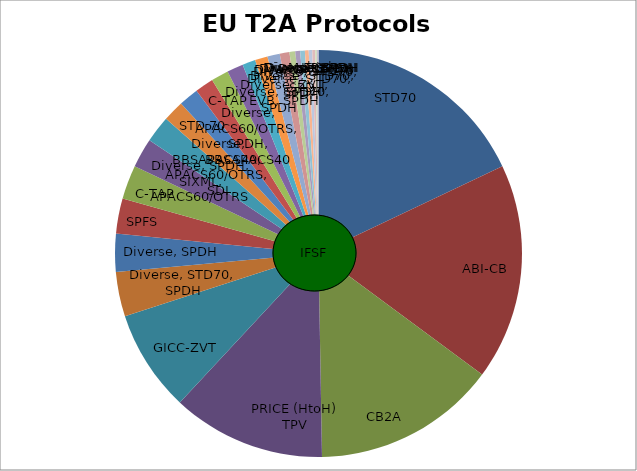
| Category | EU Terminals |
|---|---|
| STD70 | 1653.91 |
| ABI-CB | 1584.19 |
| CB2A | 1344.4 |
| PRICE (HtoH)
TPV | 1125.05 |
| GICC-ZVT | 743.62 |
| Diverse, STD70, SPDH | 326.35 |
| Diverse, SPDH | 279.16 |
| SPFS | 256.49 |
| C-TAP | 249.19 |
| Diverse, SPDH, SIXML, APACS60/OTRS | 214.71 |
| Diverse, BBSAPACS40, APACS60/OTRS, SDI | 196 |
| STD 70 | 154.16 |
| Diverse, APACS60/OTRS, SPDH, BBSAPACS40 | 144.98 |
| C-TAP | 136.25 |
| Diverse, STD70, SPDH | 128.04 |
| Diverse, ZVT, EVB, SPDH | 118.75 |
| Diverse, STD70, SPDH | 95.72 |
| Diverse, STD70, SPDH | 92.22 |
| Diverse, STD70, SPDH | 90.8 |
| Diverse, STD70 | 70.75 |
| Diverse, SPDH | 41.89 |
| Diverse | 35.59 |
| Diverse, SPDH | 34.64 |
| Diverse, SPDH | 27.46 |
| Diverse, SPDH | 25.92 |
| JCC | 21.49 |
| Multiple | 11.98 |
| EP2 | 11.61 |